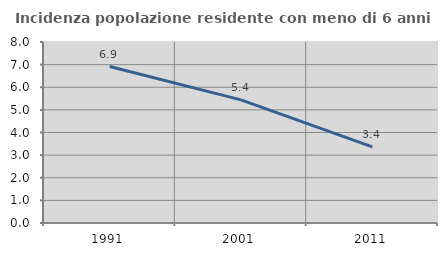
| Category | Incidenza popolazione residente con meno di 6 anni |
|---|---|
| 1991.0 | 6.916 |
| 2001.0 | 5.44 |
| 2011.0 | 3.363 |